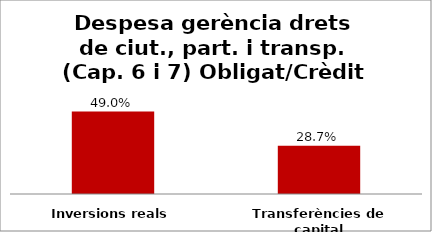
| Category | Series 0 |
|---|---|
| Inversions reals | 0.49 |
| Transferències de capital | 0.287 |